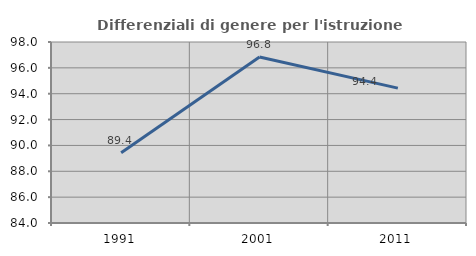
| Category | Differenziali di genere per l'istruzione superiore |
|---|---|
| 1991.0 | 89.439 |
| 2001.0 | 96.841 |
| 2011.0 | 94.434 |